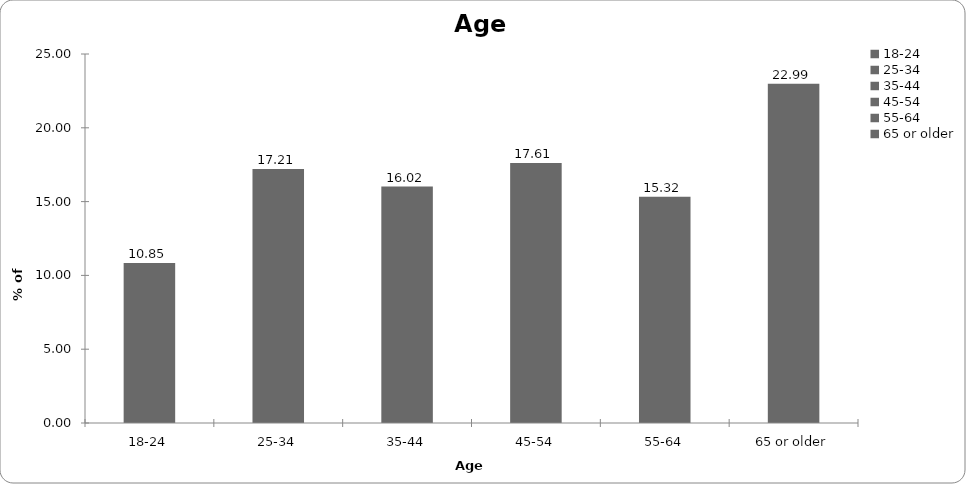
| Category | Age |
|---|---|
| 18-24 | 10.846 |
| 25-34 | 17.214 |
| 35-44 | 16.02 |
| 45-54 | 17.612 |
| 55-64 | 15.323 |
| 65 or older | 22.985 |